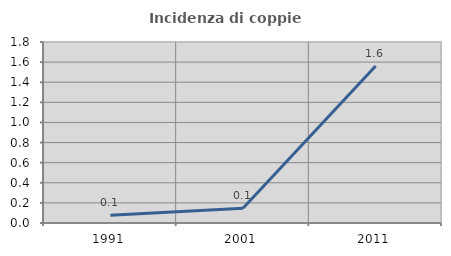
| Category | Incidenza di coppie miste |
|---|---|
| 1991.0 | 0.076 |
| 2001.0 | 0.147 |
| 2011.0 | 1.561 |